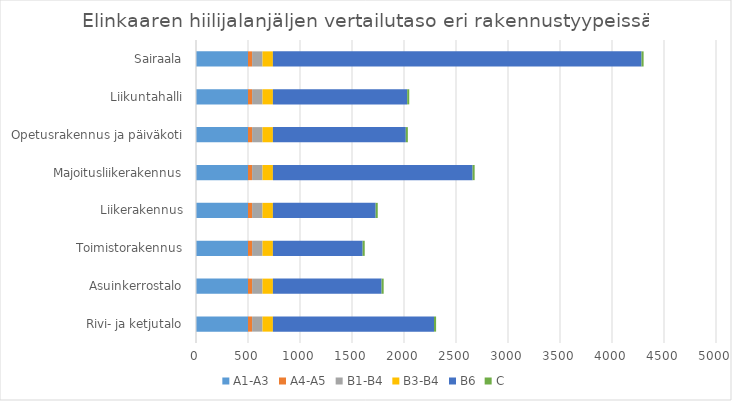
| Category | A1-A3 | A4-A5 | B1-B4 | B3-B4 | B6 | C |
|---|---|---|---|---|---|---|
| Rivi- ja ketjutalo | 500 | 39.4 | 100 | 100 | 1549.213 | 20 |
| Asuinkerrostalo | 500 | 39.4 | 100 | 100 | 1045.154 | 20 |
| Toimistorakennus | 500 | 39.4 | 100 | 100 | 862.983 | 20 |
| Liikerakennus | 500 | 39.4 | 100 | 100 | 988.159 | 20 |
| Majoitusliikerakennus | 500 | 39.4 | 100 | 100 | 1920.001 | 20 |
| Opetusrakennus ja päiväkoti | 500 | 39.4 | 100 | 100 | 1277.693 | 20 |
| Liikuntahalli | 500 | 39.4 | 100 | 100 | 1291.072 | 20 |
| Sairaala | 500 | 39.4 | 100 | 100 | 3544.622 | 20 |